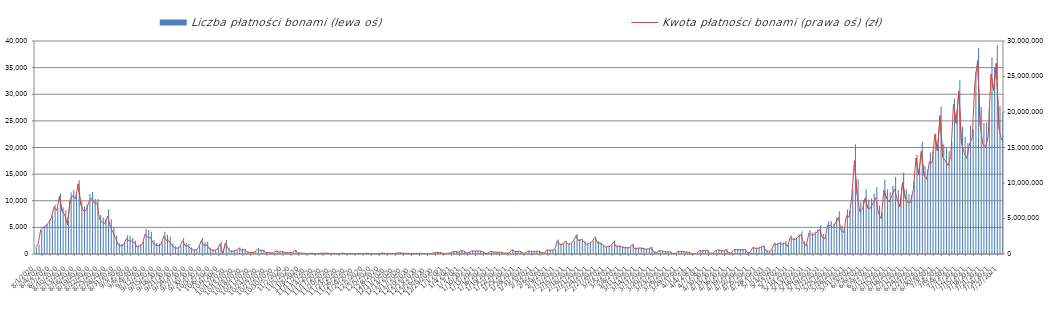
| Category | Liczba płatności bonami (lewa oś) |
|---|---|
| 8/1/20 | 1199 |
| 8/2/20 | 1736 |
| 8/3/20 | 4575 |
| 8/4/20 | 5190 |
| 8/5/20 | 5616 |
| 8/6/20 | 6419 |
| 8/7/20 | 7390 |
| 8/8/20 | 9264 |
| 8/9/20 | 8628 |
| 8/10/20 | 11404 |
| 8/11/20 | 8789 |
| 8/12/20 | 8201 |
| 8/13/20 | 6210 |
| 8/14/20 | 11534 |
| 8/15/20 | 12006 |
| 8/16/20 | 11229 |
| 8/17/20 | 13867 |
| 8/18/20 | 9899 |
| 8/19/20 | 8911 |
| 8/20/20 | 9336 |
| 8/21/20 | 11285 |
| 8/22/20 | 11629 |
| 8/23/20 | 10353 |
| 8/24/20 | 10320 |
| 8/25/20 | 7314 |
| 8/26/20 | 6865 |
| 8/27/20 | 6574 |
| 8/28/20 | 8453 |
| 8/29/20 | 6545 |
| 8/30/20 | 5126 |
| 8/31/20 | 3435 |
| 9/1/20 | 2009 |
| 9/2/20 | 1865 |
| 9/3/20 | 2096 |
| 9/4/20 | 3542 |
| 9/5/20 | 3432 |
| 9/6/20 | 3003 |
| 9/7/20 | 2501 |
| 9/8/20 | 1579 |
| 9/9/20 | 1801 |
| 9/10/20 | 2354 |
| 9/11/20 | 4690 |
| 9/12/20 | 4518 |
| 9/13/20 | 4166 |
| 9/14/20 | 2576 |
| 9/15/20 | 2051 |
| 9/16/20 | 1944 |
| 9/17/20 | 2291 |
| 9/18/20 | 4162 |
| 9/19/20 | 3622 |
| 9/20/20 | 3294 |
| 9/21/20 | 1961 |
| 9/22/20 | 1453 |
| 9/23/20 | 1338 |
| 9/24/20 | 1663 |
| 9/25/20 | 2991 |
| 9/26/20 | 2128 |
| 9/27/20 | 1921 |
| 9/28/20 | 1246 |
| 9/29/20 | 883 |
| 9/30/20 | 952 |
| 10/1/20 | 1436 |
| 10/2/20 | 3049 |
| 10/3/20 | 2199 |
| 10/4/20 | 2322 |
| 10/5/20 | 1208 |
| 10/6/20 | 872 |
| 10/7/20 | 793 |
| 10/8/20 | 1113 |
| 10/9/20 | 2308 |
| 10/10/20 | 0 |
| 10/11/20 | 2629 |
| 10/12/20 | 1195 |
| 10/13/20 | 648 |
| 10/14/20 | 632 |
| 10/15/20 | 767 |
| 10/16/20 | 1288 |
| 10/17/20 | 1028 |
| 10/18/20 | 946 |
| 10/19/20 | 527 |
| 10/20/20 | 359 |
| 10/21/20 | 373 |
| 10/22/20 | 497 |
| 10/23/20 | 1144 |
| 10/24/20 | 839 |
| 10/25/20 | 850 |
| 10/26/20 | 387 |
| 10/27/20 | 259 |
| 10/28/20 | 253 |
| 10/29/20 | 229 |
| 10/30/20 | 647 |
| 10/31/20 | 442 |
| 11/1/20 | 551 |
| 11/2/20 | 369 |
| 11/3/20 | 270 |
| 11/4/20 | 260 |
| 11/5/20 | 336 |
| 11/6/20 | 790 |
| 11/7/20 | 285 |
| 11/8/20 | 245 |
| 11/9/20 | 148 |
| 11/10/20 | 141 |
| 11/11/20 | 114 |
| 11/12/20 | 159 |
| 11/13/20 | 139 |
| 11/14/20 | 105 |
| 11/15/20 | 137 |
| 11/16/20 | 146 |
| 11/17/20 | 165 |
| 11/18/20 | 173 |
| 11/19/20 | 103 |
| 11/20/20 | 185 |
| 11/21/20 | 90 |
| 11/22/20 | 101 |
| 11/23/20 | 114 |
| 11/24/20 | 164 |
| 11/25/20 | 94 |
| 11/26/20 | 115 |
| 11/27/20 | 129 |
| 11/28/20 | 74 |
| 11/29/20 | 93 |
| 11/30/20 | 109 |
| 12/1/20 | 116 |
| 12/2/20 | 124 |
| 12/3/20 | 146 |
| 12/4/20 | 127 |
| 12/5/20 | 50 |
| 12/6/20 | 72 |
| 12/7/20 | 139 |
| 12/8/20 | 127 |
| 12/9/20 | 191 |
| 12/10/20 | 110 |
| 12/11/20 | 190 |
| 12/12/20 | 114 |
| 12/13/20 | 81 |
| 12/14/20 | 208 |
| 12/15/20 | 233 |
| 12/16/20 | 207 |
| 12/17/20 | 143 |
| 12/18/20 | 160 |
| 12/19/20 | 118 |
| 12/20/20 | 68 |
| 12/21/20 | 160 |
| 12/22/20 | 116 |
| 12/23/20 | 155 |
| 12/24/20 | 44 |
| 12/25/20 | 33 |
| 12/26/20 | 56 |
| 12/27/20 | 95 |
| 12/28/20 | 295 |
| 12/29/20 | 305 |
| 12/30/20 | 324 |
| 12/31/20 | 192 |
| 1/1/21 | 47 |
| 1/2/21 | 148 |
| 1/3/21 | 207 |
| 1/4/21 | 488 |
| 1/5/21 | 514 |
| 1/6/21 | 397 |
| 1/7/21 | 721 |
| 1/8/21 | 633 |
| 1/9/21 | 265 |
| 1/10/21 | 352 |
| 1/11/21 | 651 |
| 1/12/21 | 582 |
| 1/13/21 | 580 |
| 1/14/21 | 620 |
| 1/15/21 | 491 |
| 1/16/21 | 175 |
| 1/17/21 | 133 |
| 1/18/21 | 506 |
| 1/19/21 | 408 |
| 1/20/21 | 376 |
| 1/21/21 | 316 |
| 1/22/21 | 383 |
| 1/23/21 | 169 |
| 1/24/21 | 215 |
| 1/25/21 | 174 |
| 1/26/21 | 831 |
| 1/27/21 | 548 |
| 1/28/21 | 504 |
| 1/29/21 | 527 |
| 1/30/21 | 184 |
| 1/31/21 | 193 |
| 2/1/21 | 599 |
| 2/2/21 | 565 |
| 2/3/21 | 503 |
| 2/4/21 | 581 |
| 2/5/21 | 629 |
| 2/6/21 | 300 |
| 2/7/21 | 225 |
| 2/8/21 | 801 |
| 2/9/21 | 812 |
| 2/10/21 | 808 |
| 2/11/21 | 830 |
| 2/12/21 | 2701 |
| 2/13/21 | 1975 |
| 2/14/21 | 2041 |
| 2/15/21 | 2473 |
| 2/16/21 | 1909 |
| 2/17/21 | 2042 |
| 2/18/21 | 2490 |
| 2/19/21 | 3706 |
| 2/20/21 | 2776 |
| 2/21/21 | 2865 |
| 2/22/21 | 2398 |
| 2/23/21 | 1954 |
| 2/24/21 | 2089 |
| 2/25/21 | 2464 |
| 2/26/21 | 3266 |
| 2/27/21 | 2404 |
| 2/28/21 | 2153 |
| 3/1/21 | 1740 |
| 3/2/21 | 1384 |
| 3/3/21 | 1558 |
| 3/4/21 | 1654 |
| 3/5/21 | 2528 |
| 3/6/21 | 1621 |
| 3/7/21 | 1639 |
| 3/8/21 | 1415 |
| 3/9/21 | 1302 |
| 3/10/21 | 1305 |
| 3/11/21 | 1281 |
| 3/12/21 | 1940 |
| 3/13/21 | 1194 |
| 3/14/21 | 1187 |
| 3/15/21 | 1241 |
| 3/16/21 | 1125 |
| 3/17/21 | 991 |
| 3/18/21 | 1095 |
| 3/19/21 | 1373 |
| 3/20/21 | 467 |
| 3/21/21 | 314 |
| 3/22/21 | 701 |
| 3/23/21 | 630 |
| 3/24/21 | 524 |
| 3/25/21 | 447 |
| 3/26/21 | 481 |
| 3/27/21 | 150 |
| 3/28/21 | 109 |
| 3/29/21 | 556 |
| 3/30/21 | 557 |
| 3/31/21 | 575 |
| 4/1/21 | 391 |
| 4/2/21 | 396 |
| 4/3/21 | 135 |
| 4/4/21 | 27 |
| 4/5/21 | 90 |
| 4/6/21 | 736 |
| 4/7/21 | 643 |
| 4/8/21 | 675 |
| 4/9/21 | 688 |
| 4/10/21 | 185 |
| 4/11/21 | 186 |
| 4/12/21 | 699 |
| 4/13/21 | 822 |
| 4/14/21 | 731 |
| 4/15/21 | 618 |
| 4/16/21 | 922 |
| 4/17/21 | 241 |
| 4/18/21 | 255 |
| 4/19/21 | 914 |
| 4/20/21 | 887 |
| 4/21/21 | 877 |
| 4/22/21 | 866 |
| 4/23/21 | 923 |
| 4/24/21 | 315 |
| 4/25/21 | 300 |
| 4/26/21 | 1336 |
| 4/27/21 | 1179 |
| 4/28/21 | 1173 |
| 4/29/21 | 1428 |
| 4/30/21 | 1602 |
| 5/1/21 | 698 |
| 5/2/21 | 481 |
| 5/3/21 | 822 |
| 5/4/21 | 2109 |
| 5/5/21 | 2047 |
| 5/6/21 | 2277 |
| 5/7/21 | 2164 |
| 5/8/21 | 2435 |
| 5/9/21 | 1722 |
| 5/10/21 | 3528 |
| 5/11/21 | 3100 |
| 5/12/21 | 3049 |
| 5/13/21 | 3656 |
| 5/14/21 | 4276 |
| 5/15/21 | 2378 |
| 5/16/21 | 1842 |
| 5/17/21 | 4500 |
| 5/18/21 | 4055 |
| 5/19/21 | 4158 |
| 5/20/21 | 4644 |
| 5/21/21 | 5360 |
| 5/22/21 | 3736 |
| 5/23/21 | 3468 |
| 5/24/21 | 6162 |
| 5/25/21 | 6153 |
| 5/26/21 | 5694 |
| 5/27/21 | 6855 |
| 5/28/21 | 8031 |
| 5/29/21 | 5329 |
| 5/30/21 | 4806 |
| 5/31/21 | 8352 |
| 6/1/21 | 8107 |
| 6/2/21 | 12054 |
| 6/3/21 | 20616 |
| 6/4/21 | 14019 |
| 6/5/21 | 9801 |
| 6/6/21 | 10145 |
| 6/7/21 | 12185 |
| 6/8/21 | 10188 |
| 6/9/21 | 10410 |
| 6/10/21 | 11383 |
| 6/11/21 | 12579 |
| 6/12/21 | 9112 |
| 6/13/21 | 7789 |
| 6/14/21 | 14004 |
| 6/15/21 | 12152 |
| 6/16/21 | 11591 |
| 6/17/21 | 12775 |
| 6/18/21 | 14459 |
| 6/19/21 | 12003 |
| 6/20/21 | 10576 |
| 6/21/21 | 15314 |
| 6/22/21 | 12144 |
| 6/23/21 | 11314 |
| 6/24/21 | 11118 |
| 6/25/21 | 13779 |
| 6/26/21 | 18577 |
| 6/27/21 | 16178 |
| 6/28/21 | 21028 |
| 6/29/21 | 16523 |
| 6/30/21 | 15871 |
| 7/1/21 | 19055 |
| 7/2/21 | 19286 |
| 7/3/21 | 22585 |
| 7/4/21 | 20460 |
| 7/5/21 | 27714 |
| 7/6/21 | 20570 |
| 7/7/21 | 20105 |
| 7/8/21 | 19296 |
| 7/9/21 | 21119 |
| 7/10/21 | 29146 |
| 7/11/21 | 26845 |
| 7/12/21 | 32612 |
| 7/13/21 | 23884 |
| 7/14/21 | 22031 |
| 7/15/21 | 20863 |
| 7/16/21 | 24102 |
| 7/17/21 | 23449 |
| 7/18/21 | 34260 |
| 7/19/21 | 38714 |
| 7/20/21 | 27606 |
| 7/21/21 | 24580 |
| 7/22/21 | 24672 |
| 7/23/21 | 27141 |
| 7/24/21 | 36923 |
| 7/25/21 | 35087 |
| 7/26/21 | 39189 |
| 7/27/21 | 27812 |
| 7/28/21 | 26523 |